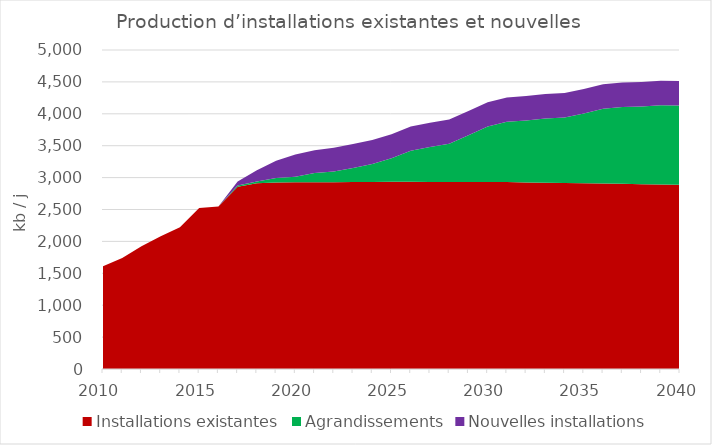
| Category | Installations existantes | Agrandissements | Nouvelles installations |
|---|---|---|---|
| 2010.0 | 1609.385 | 0 | 0 |
| 2011.0 | 1739.876 | 0 | 0 |
| 2012.0 | 1922.172 | 0 | 0 |
| 2013.0 | 2082.158 | 0 | 0 |
| 2014.0 | 2222.828 | 0 | 0 |
| 2015.0 | 2523.264 | 0 | 0 |
| 2016.0 | 2545.512 | 0 | 0 |
| 2017.0 | 2855.869 | 20.684 | 62.052 |
| 2018.0 | 2911.055 | 27.807 | 177.828 |
| 2019.0 | 2921.805 | 73.685 | 269.081 |
| 2020.0 | 2926.528 | 86.72 | 348.803 |
| 2021.0 | 2928.258 | 142.285 | 356.203 |
| 2022.0 | 2927.429 | 168.852 | 372.84 |
| 2023.0 | 2931.611 | 217.513 | 376.671 |
| 2024.0 | 2932.08 | 280.7 | 376.586 |
| 2025.0 | 2935.325 | 367.117 | 377.338 |
| 2026.0 | 2934.685 | 486.886 | 378.183 |
| 2027.0 | 2931.854 | 548.136 | 379.145 |
| 2028.0 | 2931.689 | 600.197 | 379.184 |
| 2029.0 | 2929.823 | 732.527 | 380.79 |
| 2030.0 | 2931.194 | 868.026 | 381.238 |
| 2031.0 | 2929.979 | 944.884 | 381.945 |
| 2032.0 | 2924.78 | 971.86 | 381.785 |
| 2033.0 | 2920.439 | 1007.216 | 383.097 |
| 2034.0 | 2915.66 | 1026.41 | 383.417 |
| 2035.0 | 2912.463 | 1093.127 | 383.921 |
| 2036.0 | 2907.91 | 1172.517 | 383.597 |
| 2037.0 | 2903.002 | 1204.202 | 384.662 |
| 2038.0 | 2897.602 | 1217.618 | 384.98 |
| 2039.0 | 2892.214 | 1241.627 | 385.484 |
| 2040.0 | 2886.5 | 1244.355 | 384.874 |